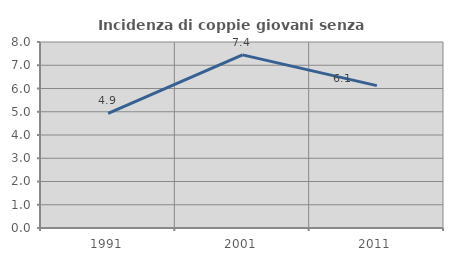
| Category | Incidenza di coppie giovani senza figli |
|---|---|
| 1991.0 | 4.93 |
| 2001.0 | 7.447 |
| 2011.0 | 6.122 |